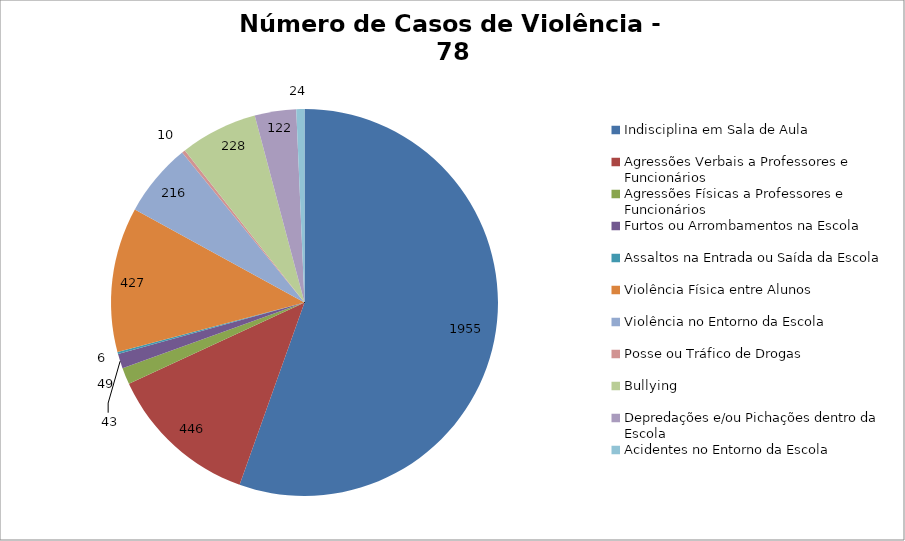
| Category | Número de Casos |
|---|---|
| Indisciplina em Sala de Aula | 1955 |
| Agressões Verbais a Professores e Funcionários | 446 |
| Agressões Físicas a Professores e Funcionários | 49 |
| Furtos ou Arrombamentos na Escola | 43 |
| Assaltos na Entrada ou Saída da Escola | 6 |
| Violência Física entre Alunos | 427 |
| Violência no Entorno da Escola | 216 |
| Posse ou Tráfico de Drogas | 10 |
| Bullying | 228 |
| Depredações e/ou Pichações dentro da Escola | 122 |
| Acidentes no Entorno da Escola | 24 |